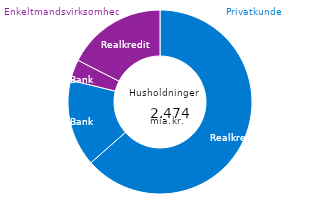
| Category | Udlån |
|---|---|
| Privatkunder - Realkreditgæld | 1571.705 |
| Privatkunder - Bankgæld | 378.091 |
| Enkeltmandsvirksomheder - Realkreditgæld | 90.904 |
| Enkeltmandsvirksomheder - Bankgæld | 433.325 |